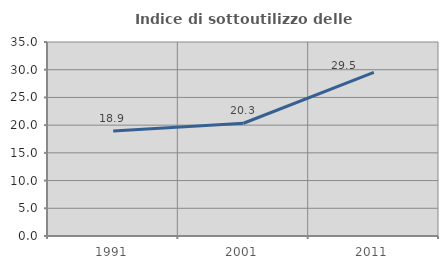
| Category | Indice di sottoutilizzo delle abitazioni  |
|---|---|
| 1991.0 | 18.937 |
| 2001.0 | 20.34 |
| 2011.0 | 29.532 |